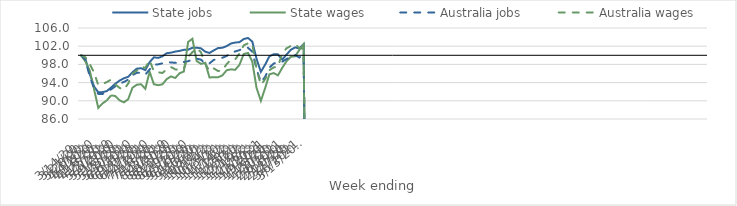
| Category | State jobs | State wages | Australia jobs | Australia wages |
|---|---|---|---|---|
| 14/03/2020 | 100 | 100 | 100 | 100 |
| 21/03/2020 | 99.17 | 98.631 | 98.956 | 99.571 |
| 28/03/2020 | 95.941 | 96.686 | 95.411 | 98.095 |
| 04/04/2020 | 93.187 | 92.62 | 92.814 | 96.217 |
| 11/04/2020 | 91.863 | 88.446 | 91.522 | 93.51 |
| 18/04/2020 | 91.91 | 89.428 | 91.499 | 93.706 |
| 25/04/2020 | 92.136 | 90.086 | 92.024 | 94.115 |
| 02/05/2020 | 92.924 | 91.198 | 92.518 | 94.669 |
| 09/05/2020 | 93.762 | 91.039 | 93.198 | 93.587 |
| 16/05/2020 | 94.455 | 90.098 | 93.789 | 92.821 |
| 23/05/2020 | 94.943 | 89.657 | 94.145 | 92.476 |
| 30/05/2020 | 95.273 | 90.367 | 94.654 | 93.783 |
| 06/06/2020 | 96.28 | 92.876 | 95.642 | 95.969 |
| 13/06/2020 | 97.057 | 93.53 | 96.146 | 96.63 |
| 20/06/2020 | 97.164 | 93.646 | 96.166 | 97.54 |
| 27/06/2020 | 96.764 | 92.639 | 95.757 | 97.254 |
| 04/07/2020 | 98.486 | 96.387 | 96.891 | 98.931 |
| 11/07/2020 | 99.562 | 93.647 | 97.918 | 96.452 |
| 18/07/2020 | 99.429 | 93.429 | 98.015 | 96.287 |
| 25/07/2020 | 99.776 | 93.625 | 98.234 | 96.104 |
| 01/08/2020 | 100.461 | 94.772 | 98.45 | 96.943 |
| 08/08/2020 | 100.584 | 95.359 | 98.442 | 97.412 |
| 15/08/2020 | 100.82 | 95.015 | 98.335 | 96.914 |
| 22/08/2020 | 100.965 | 96.05 | 98.39 | 96.757 |
| 29/08/2020 | 101.2 | 96.431 | 98.521 | 96.978 |
| 05/09/2020 | 101.241 | 102.926 | 98.687 | 99.677 |
| 12/09/2020 | 101.649 | 103.636 | 99.091 | 100.68 |
| 19/09/2020 | 101.674 | 98.749 | 99.254 | 101.536 |
| 26/09/2020 | 101.528 | 98.114 | 99.049 | 100.689 |
| 03/10/2020 | 100.8 | 98.351 | 98.196 | 98.175 |
| 10/10/2020 | 100.512 | 95.125 | 98.237 | 96.534 |
| 17/10/2020 | 101.083 | 95.19 | 98.99 | 97.113 |
| 24/10/2020 | 101.585 | 95.188 | 99.254 | 96.552 |
| 31/10/2020 | 101.652 | 95.569 | 99.461 | 96.668 |
| 07/11/2020 | 102.012 | 96.702 | 99.844 | 98.053 |
| 14/11/2020 | 102.58 | 96.914 | 100.553 | 99.053 |
| 21/11/2020 | 102.805 | 96.809 | 100.846 | 99.075 |
| 28/11/2020 | 102.888 | 97.906 | 101.126 | 100.407 |
| 05/12/2020 | 103.573 | 100.286 | 101.622 | 102.179 |
| 12/12/2020 | 103.81 | 100.515 | 101.647 | 102.628 |
| 19/12/2020 | 103.008 | 98.596 | 100.808 | 102.478 |
| 26/12/2020 | 99.204 | 92.808 | 96.977 | 96.957 |
| 02/01/2021 | 96.362 | 89.981 | 94.05 | 93.527 |
| 09/01/2021 | 97.949 | 92.798 | 95.274 | 94.722 |
| 16/01/2021 | 99.772 | 95.82 | 97.292 | 96.737 |
| 23/01/2021 | 100.232 | 96.09 | 98.18 | 97.336 |
| 30/01/2021 | 100.202 | 95.6 | 98.522 | 97.507 |
| 06/02/2021 | 99.071 | 97.252 | 98.581 | 100.419 |
| 13/02/2021 | 100.154 | 98.699 | 99.185 | 101.54 |
| 20/02/2021 | 101.212 | 99.678 | 99.643 | 102.046 |
| 27/02/2021 | 101.734 | 99.779 | 100.036 | 102.451 |
| 06/03/2021 | 101.51 | 101.175 | 99.503 | 101.603 |
| 13/03/2021 | 102.46 | 102.435 | 100.244 | 101.4 |